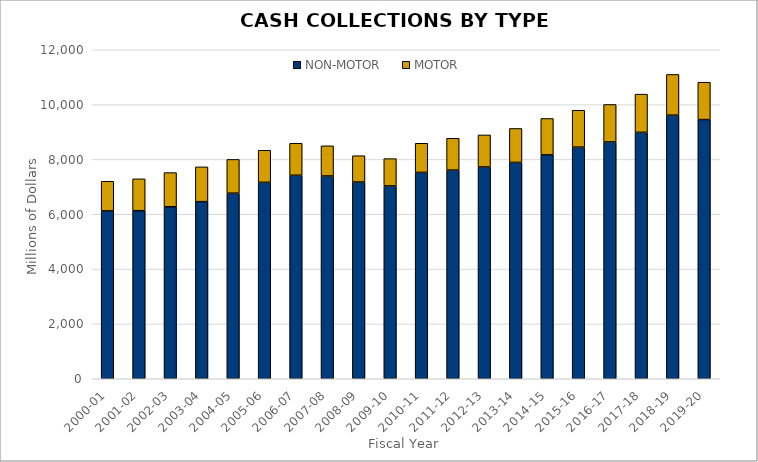
| Category | NON-MOTOR | MOTOR |
|---|---|---|
| 2000-01 | 6123.744 | 1080.012 |
| 2001-02 | 6130.744 | 1161.755 |
| 2002-03 | 6273.675 | 1245.886 |
| 2003-04 | 6459.847 | 1268.695 |
| 2004-05 | 6769.564 | 1230.388 |
| 2005-06 | 7165.173 | 1169.076 |
| 2006-07 | 7421.851 | 1168.918 |
| 2007-08 | 7395.739 | 1100.815 |
| 2008-09 | 7175.963 | 959.545 |
| 2009-10 | 7033.457 | 995.712 |
| 2010-11 | 7527.354 | 1062.863 |
| 2011-12 | 7611.651 | 1160.614 |
| 2012-13 | 7726.133 | 1167.581 |
| 2013-14 | 7892.041 | 1237.58 |
| 2014-15 | 8166.891 | 1326.216 |
| 2015-16 | 8447.951 | 1347.238 |
| 2016-17 | 8637.681 | 1366.778 |
| 2017-18 | 8988.66 | 1392.699 |
| 2018-19 | 9616.04 | 1483.608 |
| 2019-20 | 9452.848 | 1364.959 |